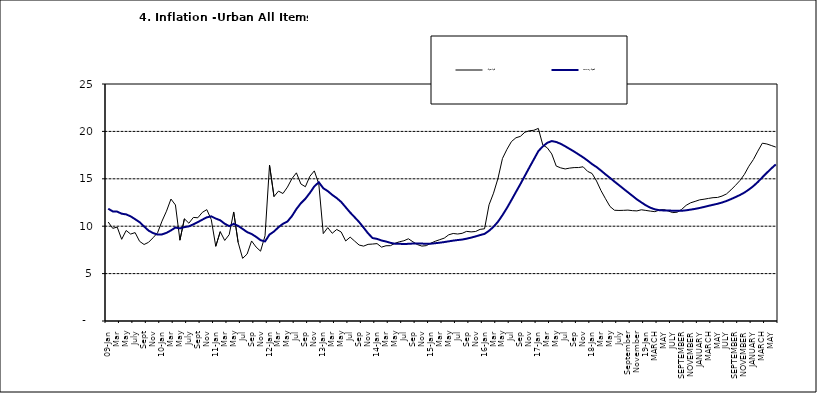
| Category | Year-on Rate | 12-Month Average |
|---|---|---|
| 09-Jan | 10.439 | 11.844 |
| Feb | 9.772 | 11.562 |
| Mar | 9.907 | 11.538 |
| Apr | 8.618 | 11.319 |
| May | 9.547 | 11.246 |
| June | 9.17 | 11.039 |
| July | 9.325 | 10.738 |
| Aug | 8.401 | 10.424 |
| Sept | 8.07 | 9.973 |
| Oct | 8.3 | 9.535 |
| Nov | 8.781 | 9.278 |
| Dec | 9.298 | 9.117 |
| 10-Jan | 10.534 | 9.136 |
| Feb | 11.584 | 9.297 |
| Mar | 12.864 | 9.555 |
| Apr | 12.24 | 9.859 |
| May | 8.524 | 9.769 |
| June | 10.781 | 9.904 |
| July | 10.313 | 9.987 |
| Aug | 10.924 | 10.197 |
| Sept | 10.891 | 10.43 |
| Oct | 11.457 | 10.689 |
| Nov | 11.748 | 10.932 |
| Dec | 10.699 | 11.042 |
| 11-Jan | 7.878 | 10.806 |
| Feb | 9.426 | 10.623 |
| Mar | 8.498 | 10.26 |
| Apr | 9.11 | 10.005 |
| May | 11.5 | 10.249 |
| Jun | 8.278 | 10.034 |
| Jul | 6.608 | 9.711 |
| Aug | 7.061 | 9.38 |
| Sep | 8.443 | 9.178 |
| Oct | 7.802 | 8.88 |
| Nov | 7.365 | 8.525 |
| Dec | 8.993 | 8.395 |
| 12-Jan | 16.445 | 9.119 |
| Feb | 13.123 | 9.443 |
| Mar | 13.701 | 9.889 |
| Apr | 13.447 | 10.259 |
| May | 14.127 | 10.496 |
| Jun | 15.012 | 11.062 |
| Jul | 15.63 | 11.81 |
| Aug | 14.456 | 12.422 |
| Sep | 14.162 | 12.893 |
| Oct | 15.26 | 13.506 |
| Nov | 15.836 | 14.199 |
| Dec | 14.459 | 14.637 |
| 13-Jan | 9.22 | 14.006 |
| Feb | 9.85 | 13.703 |
| Mar | 9.253 | 13.302 |
| Apr | 9.657 | 12.966 |
| May | 9.385 | 12.557 |
| Jun | 8.441 | 11.999 |
| Jul | 8.849 | 11.443 |
| Aug | 8.431 | 10.946 |
| Sep | 8.013 | 10.44 |
| Oct | 7.9 | 9.849 |
| Nov | 8.086 | 9.245 |
| Dec | 8.117 | 8.75 |
| 14-Jan | 8.164 | 8.662 |
| Feb | 7.791 | 8.493 |
| Mar | 7.937 | 8.384 |
| Apr | 7.947 | 8.246 |
| May | 8.195 | 8.151 |
| Jun | 8.358 | 8.146 |
| Jul | 8.464 | 8.118 |
| Aug | 8.673 | 8.141 |
| Sep | 8.357 | 8.17 |
| Oct | 8.064 | 8.182 |
| Nov | 7.902 | 8.165 |
| Dec | 7.948 | 8.151 |
| 15-Jan | 8.211 | 8.155 |
| Feb | 8.412 | 8.206 |
| Mar | 8.579 | 8.26 |
| Apr | 8.742 | 8.326 |
| May | 9.092 | 8.403 |
| Jun | 9.232 | 8.478 |
| Jul | 9.177 | 8.54 |
| Aug | 9.25 | 8.591 |
| Sep | 9.455 | 8.684 |
| Oct | 9.398 | 8.795 |
| Nov | 9.442 | 8.922 |
| Dec | 9.665 | 9.064 |
| 16-Jan | 9.728 | 9.19 |
| Feb | 12.254 | 9.516 |
| Mar | 13.485 | 9.935 |
| Apr | 15.052 | 10.474 |
| May | 17.148 | 11.165 |
| Jun | 18.111 | 11.925 |
| Jul | 18.927 | 12.754 |
| Aug | 19.325 | 13.605 |
| Sep | 19.476 | 14.444 |
| Oct | 19.914 | 15.318 |
| Nov | 20.067 | 16.193 |
| Dec | 20.118 | 17.05 |
| 17-Jan | 20.315 | 17.914 |
| Feb | 18.569 | 18.418 |
| Mar | 18.27 | 18.794 |
| Apr | 17.621 | 18.982 |
| May | 16.343 | 18.883 |
| Jun | 16.153 | 18.692 |
| Jul | 16.038 | 18.43 |
| Aug | 16.128 | 18.151 |
| Sep | 16.183 | 17.872 |
| Oct | 16.187 | 17.567 |
| Nov | 16.267 | 17.264 |
| Dec | 15.785 | 16.921 |
| 18-Jan | 15.559 | 16.55 |
| Feb | 14.763 | 16.241 |
| Mar | 13.748 | 15.866 |
| Apr | 12.893 | 15.468 |
| May | 12.077 | 15.096 |
| June | 11.683 | 14.706 |
| July | 11.661 | 14.329 |
| August | 11.673 | 13.951 |
| September | 11.697 | 13.578 |
| October | 11.64 | 13.206 |
| November | 11.615 | 12.831 |
| December | 11.731 | 12.509 |
| 19-Jan | 11.664 | 12.203 |
| February | 11.592 | 11.954 |
| MARCH | 11.535 | 11.78 |
| APRIL | 11.696 | 11.686 |
| MAY | 11.756 | 11.662 |
| JUNE | 11.605 | 11.655 |
| JULY | 11.432 | 11.635 |
| AUGUST | 11.479 | 11.618 |
| SEPTEMBER | 11.776 | 11.626 |
| OCTOBER | 12.202 | 11.676 |
| NOVEMBER | 12.469 | 11.75 |
| DECEMBER | 12.617 | 11.827 |
| JANUARY | 12.779 | 11.923 |
| FEBRUARY | 12.847 | 12.03 |
| MARCH | 12.932 | 12.147 |
| APRIL | 13.008 | 12.258 |
| MAY | 13.033 | 12.365 |
| JUNE | 13.178 | 12.496 |
| JULY | 13.403 | 12.659 |
| AUGUST | 13.827 | 12.855 |
| SEPTEMBER | 14.306 | 13.068 |
| OCTOBER | 14.811 | 13.289 |
| NOVEMBER | 15.466 | 13.546 |
| DECEMBER | 16.327 | 13.864 |
| JANUARY | 17.03 | 14.228 |
| FEBRUARY | 17.918 | 14.66 |
| MARCH | 18.756 | 15.154 |
| APRIL | 18.675 | 15.63 |
| MAY | 18.514 | 16.086 |
| JUNE | 18.348 | 16.512 |